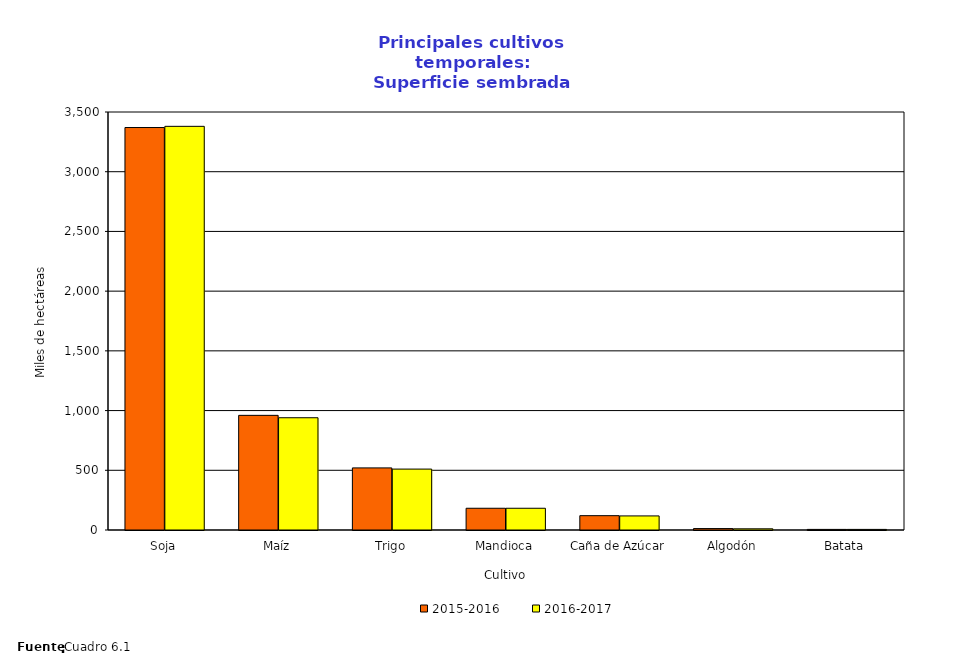
| Category | 2015-2016 | 2016-2017 |
|---|---|---|
| Soja | 3370 | 3380 |
| Maíz | 960 | 940 |
| Trigo | 520 | 510 |
| Mandioca | 182 | 182 |
| Caña de Azúcar | 120 | 118 |
| Algodón | 12 | 10 |
| Batata  | 5 | 5 |